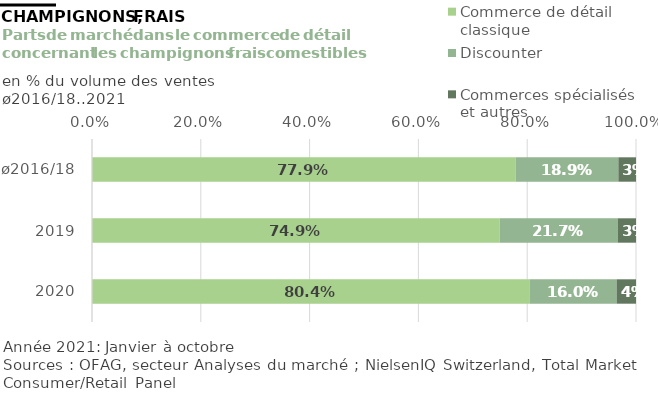
| Category | Commerce de détail classique | Discounter | Commerces spécialisés et autres |
|---|---|---|---|
| ø2016/18 | 0.779 | 0.189 | 0.032 |
| 2019 | 0.749 | 0.217 | 0.034 |
| 2020 | 0.804 | 0.16 | 0.036 |